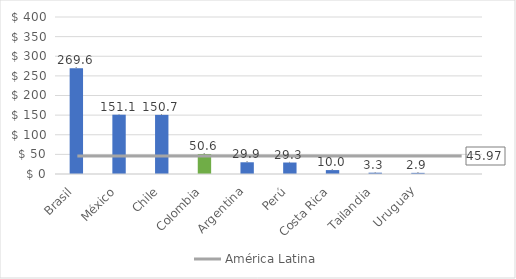
| Category | Volumen finanzas alternativas |
|---|---|
| Brasil | 269.632 |
| México | 151.094 |
| Chile | 150.695 |
| Colombia | 50.63 |
| Argentina | 29.879 |
| Perú | 29.269 |
| Costa Rica | 9.964 |
| Tailandia | 3.338 |
| Uruguay | 2.906 |